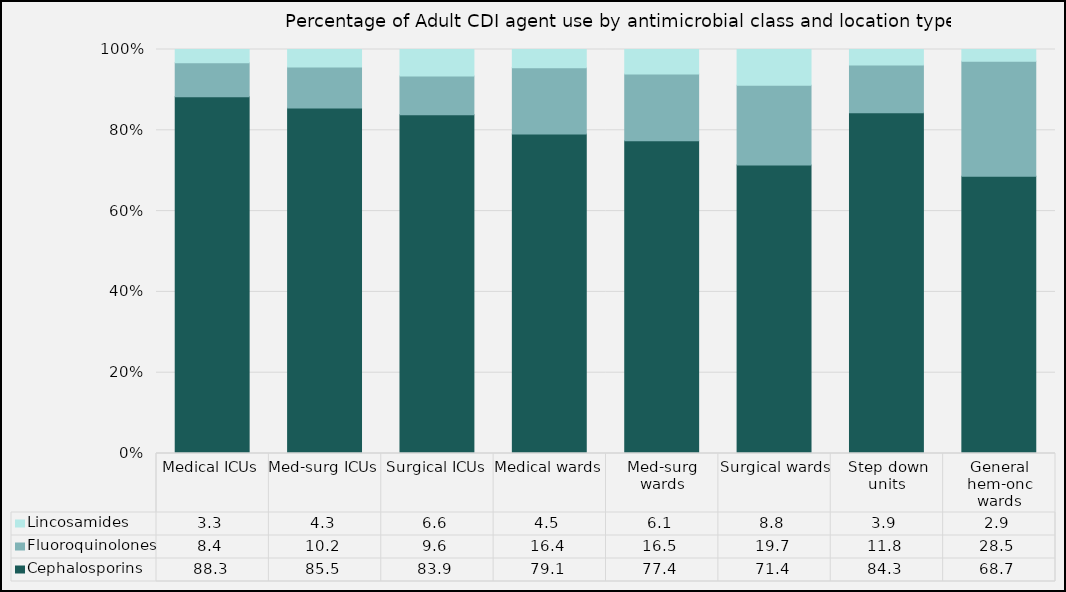
| Category | Cephalosporins | Fluoroquinolones | Lincosamides |
|---|---|---|---|
| Medical ICUs | 88.29 | 8.41 | 3.3 |
| Med-surg ICUs | 85.5 | 10.18 | 4.32 |
| Surgical ICUs | 83.85 | 9.56 | 6.59 |
| Medical wards | 79.07 | 16.42 | 4.51 |
| Med-surg wards | 77.42 | 16.51 | 6.07 |
| Surgical wards | 71.43 | 19.74 | 8.83 |
| Step down units | 84.34 | 11.8 | 3.86 |
| General hem-onc wards | 68.66 | 28.46 | 2.89 |